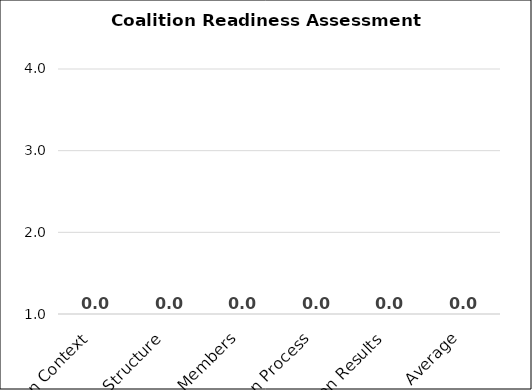
| Category | Series 0 |
|---|---|
| Coalition Context | 0 |
| Coalition Structure | 0 |
| Coalition Members | 0 |
| Coalition Process | 0 |
| Coalition Results | 0 |
| Average | 0 |